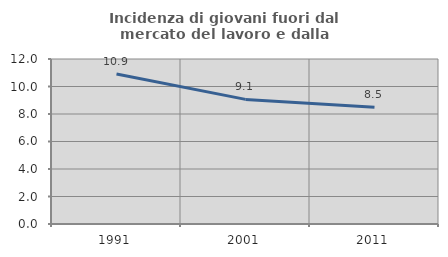
| Category | Incidenza di giovani fuori dal mercato del lavoro e dalla formazione  |
|---|---|
| 1991.0 | 10.904 |
| 2001.0 | 9.062 |
| 2011.0 | 8.499 |